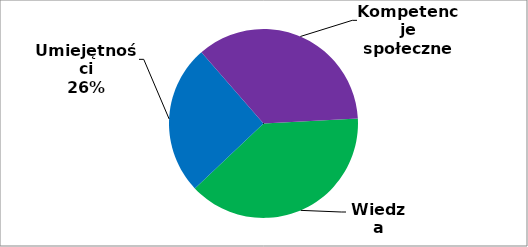
| Category | Series 0 |
|---|---|
| 0 | 121 |
| 1 | 80 |
| 2 | 111 |